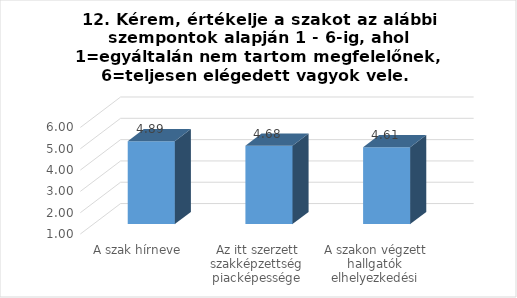
| Category | Series 0 |
|---|---|
| A szak hírneve | 4.89 |
| Az itt szerzett szakképzettség piacképessége | 4.68 |
| A szakon végzett hallgatók elhelyezkedési esélyei | 4.61 |